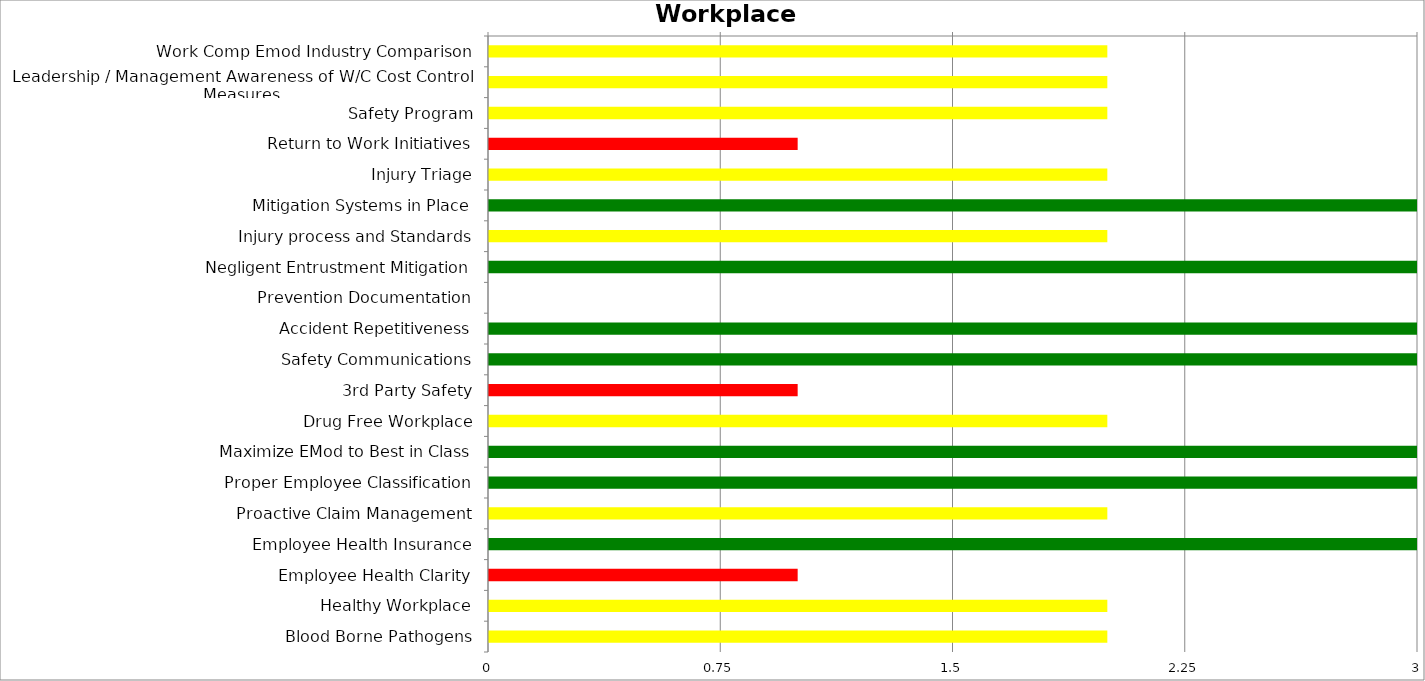
| Category | Low | Medium | High |
|---|---|---|---|
| Work Comp Emod Industry Comparison | 0 | 2 | 0 |
| Leadership / Management Awareness of W/C Cost Control Measures. | 0 | 2 | 0 |
| Safety Program | 0 | 2 | 0 |
| Return to Work Initiatives | 0 | 0 | 1 |
| Injury Triage | 0 | 2 | 0 |
| Mitigation Systems in Place | 3 | 0 | 0 |
| Injury process and Standards | 0 | 2 | 0 |
| Negligent Entrustment Mitigation | 3 | 0 | 0 |
| Prevention Documentation | 0 | 0 | 0 |
| Accident Repetitiveness | 3 | 0 | 0 |
| Safety Communications | 3 | 0 | 0 |
| 3rd Party Safety | 0 | 0 | 1 |
| Drug Free Workplace | 0 | 2 | 0 |
| Maximize EMod to Best in Class | 3 | 0 | 0 |
| Proper Employee Classification | 3 | 0 | 0 |
| Proactive Claim Management | 0 | 2 | 0 |
| Employee Health Insurance | 3 | 0 | 0 |
| Employee Health Clarity | 0 | 0 | 1 |
| Healthy Workplace | 0 | 2 | 0 |
| Blood Borne Pathogens | 0 | 2 | 0 |